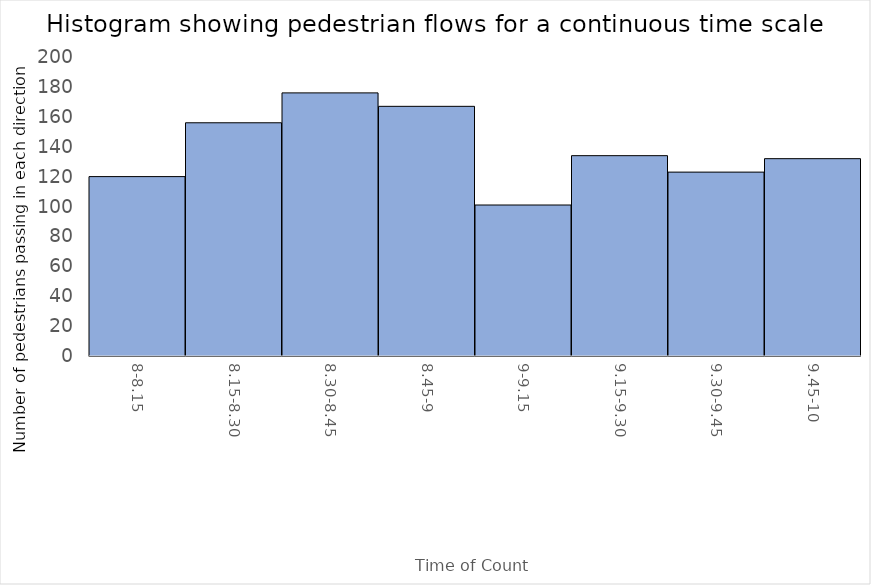
| Category | Frequency |
|---|---|
| 8-8.15 | 120 |
| 8.15-8.30 | 156 |
| 8.30-8.45 | 176 |
| 8.45-9 | 167 |
| 9-9.15 | 101 |
| 9.15-9.30 | 134 |
| 9.30-9.45 | 123 |
| 9.45-10 | 132 |